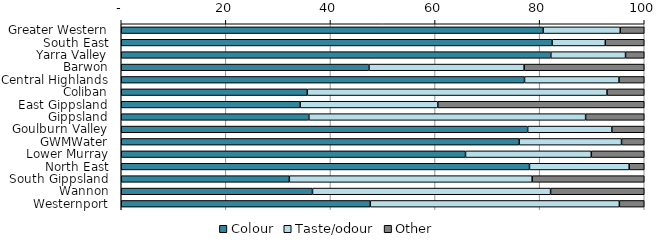
| Category | Colour | Taste/odour | Other |
|---|---|---|---|
| Greater Western | 80.676 | 14.734 | 4.589 |
| South East | 82.385 | 10.167 | 7.448 |
| Yarra Valley | 82.14 | 14.281 | 3.579 |
| Barwon | 47.368 | 29.665 | 22.967 |
| Central Highlands | 77.108 | 18.072 | 4.819 |
| Coliban | 35.573 | 57.312 | 7.115 |
| East Gippsland | 34.211 | 26.316 | 39.474 |
| Gippsland | 35.874 | 52.915 | 11.211 |
| Goulburn Valley | 77.709 | 16.099 | 6.192 |
| GWMWater | 76.087 | 19.565 | 4.348 |
| Lower Murray | 65.823 | 24.051 | 10.127 |
| North East | 78.058 | 19.065 | 2.878 |
| South Gippsland | 32.143 | 46.429 | 21.429 |
| Wannon | 36.567 | 45.522 | 17.91 |
| Westernport | 47.619 | 47.619 | 4.762 |